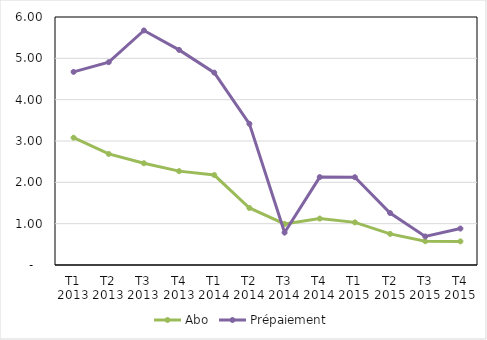
| Category | Abo | Prépaiement |
|---|---|---|
| T1 2013 | 3.08 | 4.672 |
| T2 2013 | 2.687 | 4.907 |
| T3 2013 | 2.462 | 5.674 |
| T4 2013 | 2.271 | 5.204 |
| T1 2014 | 2.176 | 4.654 |
| T2 2014 | 1.38 | 3.416 |
| T3 2014 | 0.994 | 0.785 |
| T4 2014 | 1.123 | 2.127 |
| T1 2015 | 1.031 | 2.124 |
| T2 2015 | 0.753 | 1.258 |
| T3 2015 | 0.575 | 0.69 |
| T4 2015 | 0.571 | 0.882 |